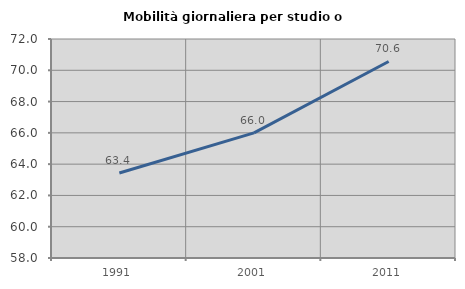
| Category | Mobilità giornaliera per studio o lavoro |
|---|---|
| 1991.0 | 63.432 |
| 2001.0 | 66.001 |
| 2011.0 | 70.563 |